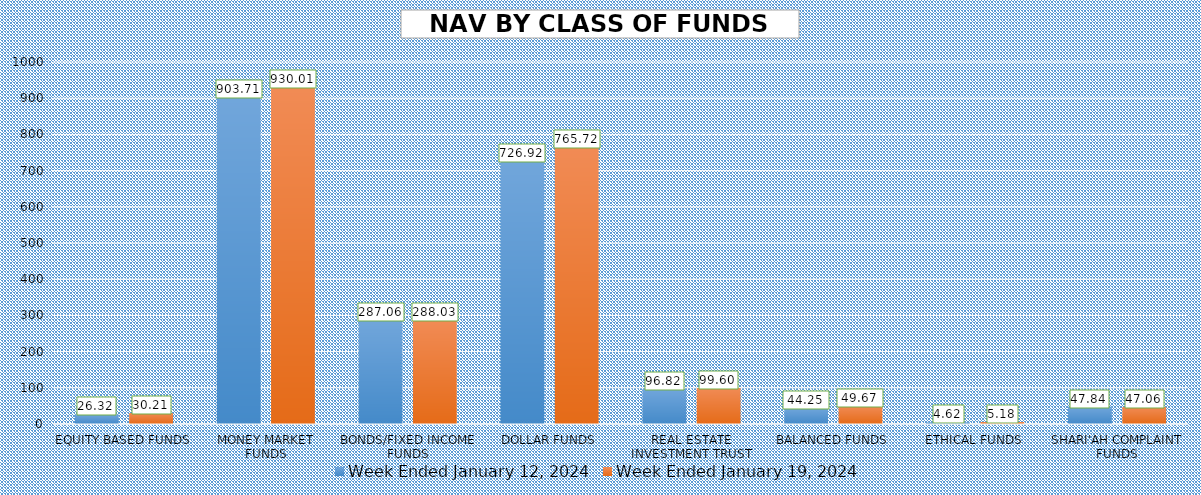
| Category | Week Ended January 12, 2024 | Week Ended January 19, 2024 |
|---|---|---|
| EQUITY BASED FUNDS | 26.318 | 30.207 |
| MONEY MARKET FUNDS | 903.708 | 930.01 |
| BONDS/FIXED INCOME FUNDS | 287.055 | 288.027 |
| DOLLAR FUNDS | 726.921 | 765.723 |
| REAL ESTATE INVESTMENT TRUST | 96.816 | 99.596 |
| BALANCED FUNDS | 44.249 | 49.667 |
| ETHICAL FUNDS | 4.62 | 5.181 |
| SHARI'AH COMPLAINT FUNDS | 47.838 | 47.061 |